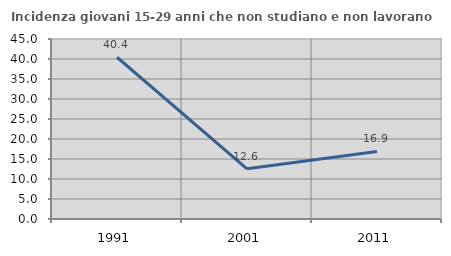
| Category | Incidenza giovani 15-29 anni che non studiano e non lavorano  |
|---|---|
| 1991.0 | 40.435 |
| 2001.0 | 12.557 |
| 2011.0 | 16.88 |